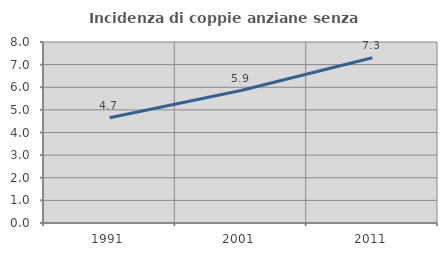
| Category | Incidenza di coppie anziane senza figli  |
|---|---|
| 1991.0 | 4.651 |
| 2001.0 | 5.854 |
| 2011.0 | 7.306 |